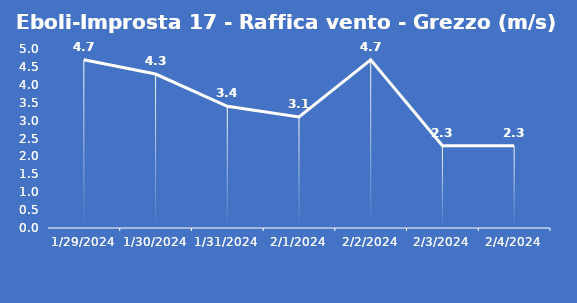
| Category | Eboli-Improsta 17 - Raffica vento - Grezzo (m/s) |
|---|---|
| 1/29/24 | 4.7 |
| 1/30/24 | 4.3 |
| 1/31/24 | 3.4 |
| 2/1/24 | 3.1 |
| 2/2/24 | 4.7 |
| 2/3/24 | 2.3 |
| 2/4/24 | 2.3 |